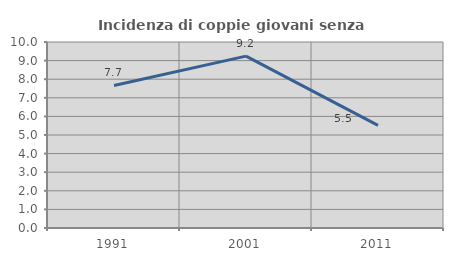
| Category | Incidenza di coppie giovani senza figli |
|---|---|
| 1991.0 | 7.663 |
| 2001.0 | 9.241 |
| 2011.0 | 5.516 |